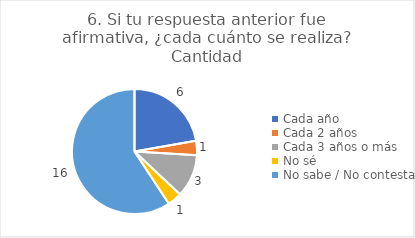
| Category | 6. Si tu respuesta anterior fue afirmativa, ¿cada cuánto se realiza? |
|---|---|
| Cada año  | 0.222 |
| Cada 2 años  | 0.037 |
| Cada 3 años o más  | 0.111 |
| No sé  | 0.037 |
| No sabe / No contesta | 0.593 |